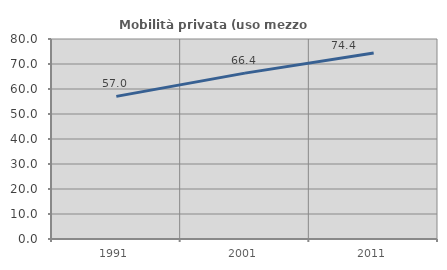
| Category | Mobilità privata (uso mezzo privato) |
|---|---|
| 1991.0 | 57.043 |
| 2001.0 | 66.356 |
| 2011.0 | 74.428 |